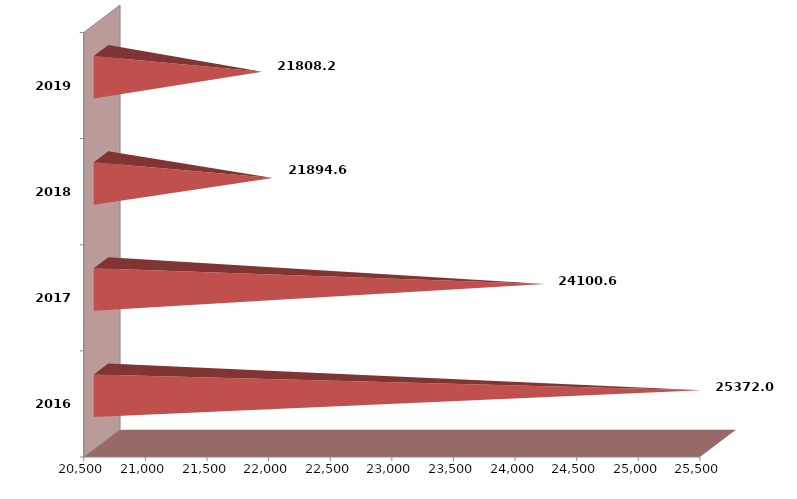
| Category | Series 1 |
|---|---|
| 2016 | 25371970 |
| 2017 | 24100596 |
| 2018 | 21894629 |
| 2019 | 21808243.217 |